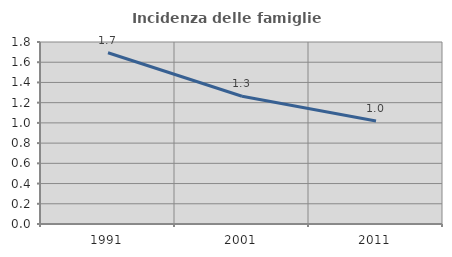
| Category | Incidenza delle famiglie numerose |
|---|---|
| 1991.0 | 1.693 |
| 2001.0 | 1.264 |
| 2011.0 | 1.018 |